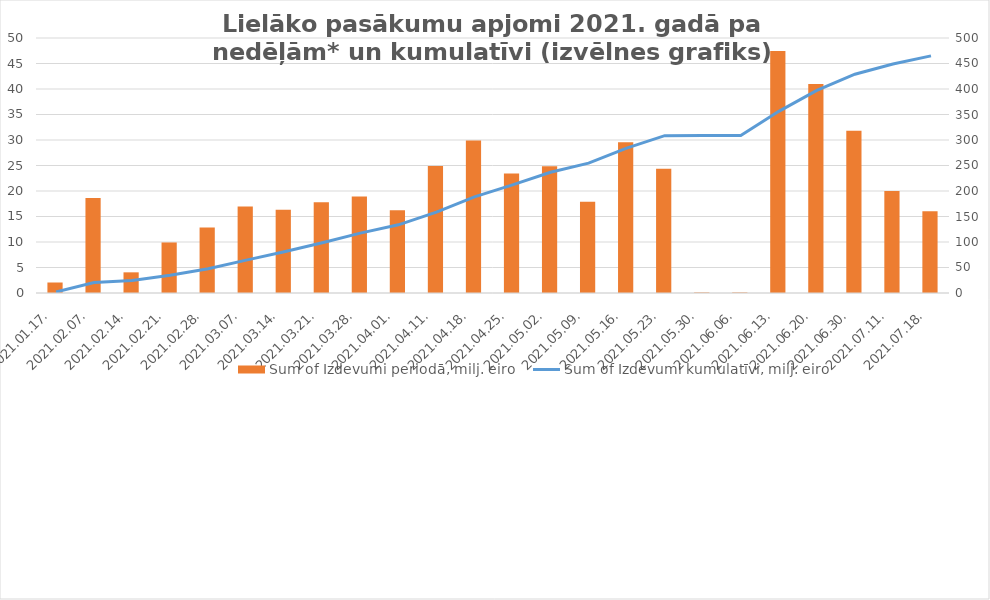
| Category | Sum of Izdevumi periodā, milj. eiro |
|---|---|
| 2021.01.17. | 2.059 |
| 2021.02.07. | 18.63 |
| 2021.02.14. | 4.051 |
| 2021.02.21. | 9.91 |
| 2021.02.28. | 12.85 |
| 2021.03.07. | 16.96 |
| 2021.03.14. | 16.3 |
| 2021.03.21. | 17.77 |
| 2021.03.28. | 18.94 |
| 2021.04.01. | 16.22 |
| 2021.04.11. | 24.92 |
| 2021.04.18. | 29.9 |
| 2021.04.25. | 23.41 |
| 2021.05.02. | 24.87 |
| 2021.05.09. | 17.87 |
| 2021.05.16. | 29.54 |
| 2021.05.23. | 24.36 |
| 2021.05.30. | 0.1 |
| 2021.06.06. | 0.1 |
| 2021.06.13. | 47.43 |
| 2021.06.20. | 40.99 |
| 2021.06.30. | 31.82 |
| 2021.07.11. | 19.98 |
| 2021.07.18. | 16.02 |